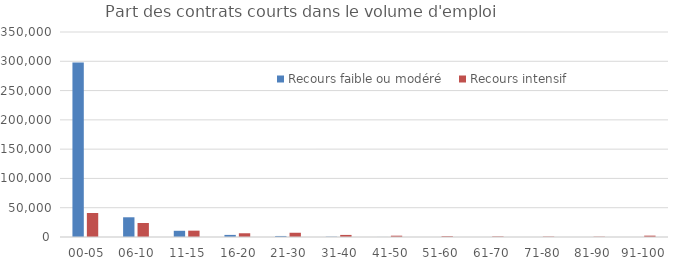
| Category | Recours faible ou modéré | Recours intensif |
|---|---|---|
| 00-05 % | 297948 | 41024 |
| 06-10 % | 33666 | 23951 |
| 11-15 % | 10606 | 10818 |
| 16-20 % | 3574 | 6369 |
| 21-30 % | 1764 | 7253 |
| 31-40 % | 558 | 3542 |
| 41-50 % | 83 | 2242 |
| 51-60 % | 0 | 1386 |
| 61-70 % | 0 | 983 |
| 71-80 % | 0 | 728 |
| 81-90 % | 0 | 587 |
| 91-100 % | 1 | 2317 |